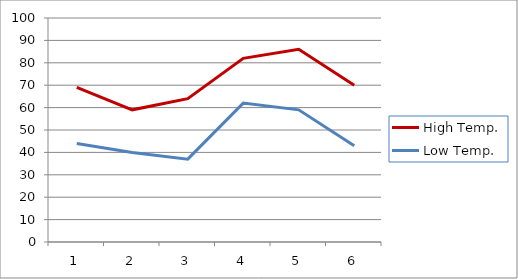
| Category | High Temp. | Low Temp. |
|---|---|---|
| 0 | 69 | 44 |
| 1 | 59 | 40 |
| 2 | 64 | 37 |
| 3 | 82 | 62 |
| 4 | 86 | 59 |
| 5 | 70 | 43 |